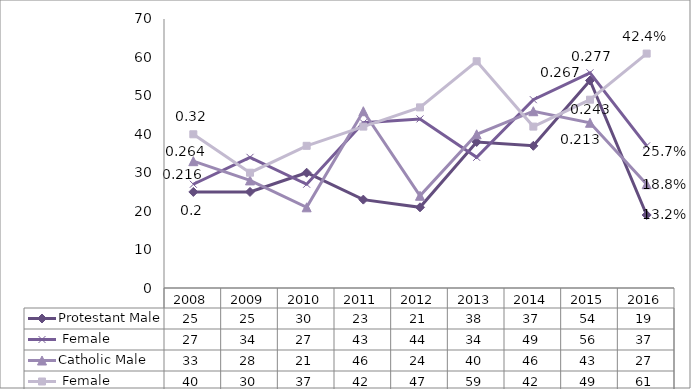
| Category | Protestant | Catholic |
|---|---|---|
| 2008.0 | 27 | 40 |
| 2009.0 | 34 | 30 |
| 2010.0 | 27 | 37 |
| 2011.0 | 43 | 42 |
| 2012.0 | 44 | 47 |
| 2013.0 | 34 | 59 |
| 2014.0 | 49 | 42 |
| 2015.0 | 56 | 49 |
| 2016.0 | 37 | 61 |